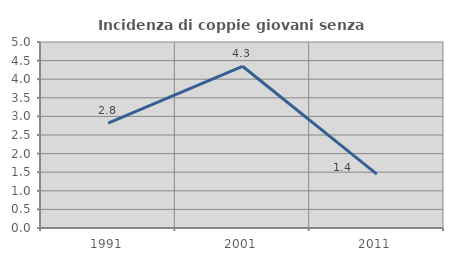
| Category | Incidenza di coppie giovani senza figli |
|---|---|
| 1991.0 | 2.817 |
| 2001.0 | 4.348 |
| 2011.0 | 1.449 |